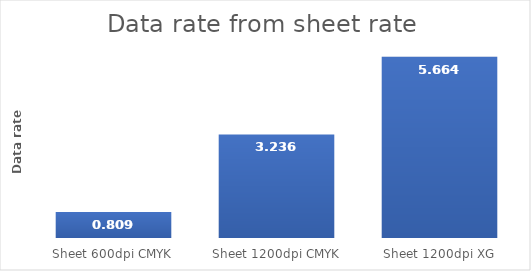
| Category | Series 0 |
|---|---|
| Sheet 600dpi CMYK | 0.809 |
| Sheet 1200dpi CMYK | 3.236 |
| Sheet 1200dpi XG | 5.664 |